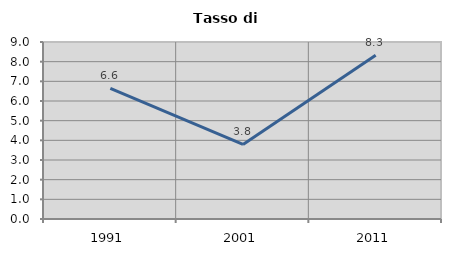
| Category | Tasso di disoccupazione   |
|---|---|
| 1991.0 | 6.641 |
| 2001.0 | 3.791 |
| 2011.0 | 8.326 |